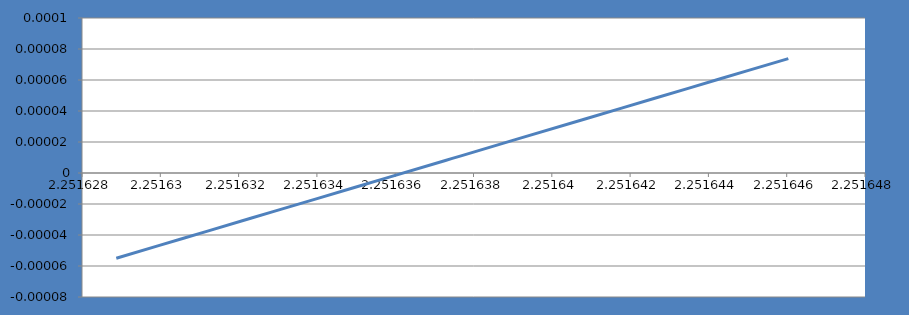
| Category | f[x] |
|---|---|
| 2.251628875732422 | 0 |
| 2.2516305923461912 | 0 |
| 2.2516323089599606 | 0 |
| 2.25163402557373 | 0 |
| 2.2516357421874993 | 0 |
| 2.2516374588012686 | 0 |
| 2.251639175415038 | 0 |
| 2.2516408920288074 | 0 |
| 2.2516426086425767 | 0 |
| 2.251644325256346 | 0 |
| 2.251646041870117 | 0 |